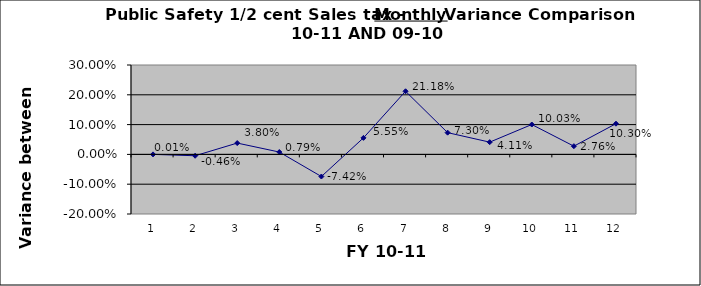
| Category | September October November December January February March April May June  July August |
|---|---|
| 0 | 0 |
| 1 | -0.005 |
| 2 | 0.038 |
| 3 | 0.008 |
| 4 | -0.074 |
| 5 | 0.055 |
| 6 | 0.212 |
| 7 | 0.073 |
| 8 | 0.041 |
| 9 | 0.1 |
| 10 | 0.028 |
| 11 | 0.103 |